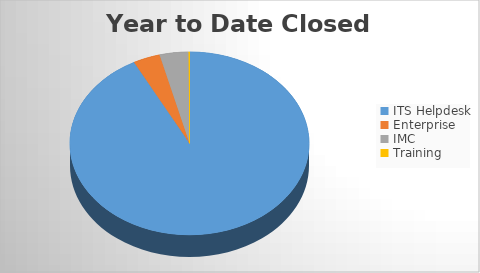
| Category | YTD Closed Tickets | 6M Opened |
|---|---|---|
| ITS Helpdesk | 3370 | 1973 |
| Enterprise | 133 | 15 |
| IMC | 142 | 58 |
| Training | 5 | 3 |